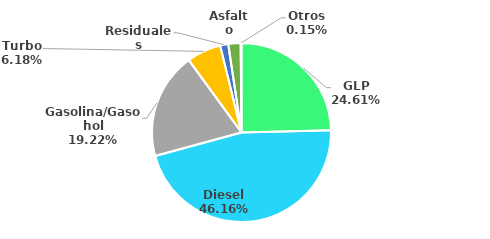
| Category | MBPD |
|---|---|
| GLP | 66.387 |
| Diesel | 124.514 |
| Gasolina/Gasohol | 51.837 |
| Turbo | 16.665 |
| Residuales | 3.943 |
| Asfalto | 6.006 |
| Otros | 0.406 |